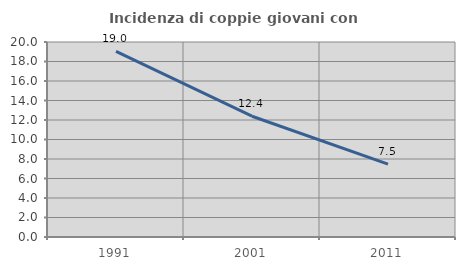
| Category | Incidenza di coppie giovani con figli |
|---|---|
| 1991.0 | 19.048 |
| 2001.0 | 12.389 |
| 2011.0 | 7.473 |